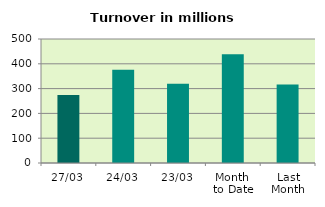
| Category | Series 0 |
|---|---|
| 27/03 | 273.893 |
| 24/03 | 375.856 |
| 23/03 | 319.569 |
| Month 
to Date | 438.474 |
| Last
Month | 316.082 |